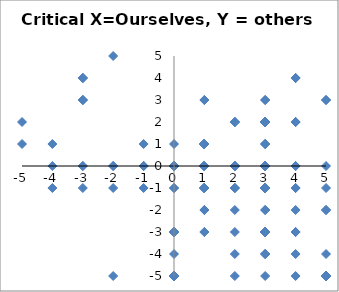
| Category | Critical_Others |
|---|---|
| -5.0 | 1 |
| -2.0 | 0 |
| -4.0 | -1 |
| 0.0 | 0 |
| 3.0 | -3 |
| 2.0 | 0 |
| 5.0 | -5 |
| 1.0 | 0 |
| 0.0 | 0 |
| -1.0 | 0 |
| 1.0 | -1 |
| 2.0 | -2 |
| 1.0 | 0 |
| -3.0 | 3 |
| -3.0 | 3 |
| 3.0 | 0 |
| 3.0 | 0 |
| 3.0 | -2 |
| -3.0 | 4 |
| -1.0 | 0 |
| 4.0 | -4 |
| -3.0 | 4 |
| 1.0 | 1 |
| 4.0 | -3 |
| 1.0 | 0 |
| 1.0 | -3 |
| 1.0 | 0 |
| 1.0 | 0 |
| 1.0 | 0 |
| 5.0 | -1 |
| 1.0 | 1 |
| 1.0 | 1 |
| 3.0 | -1 |
| 1.0 | 1 |
| 1.0 | 1 |
| 1.0 | 1 |
| 4.0 | -2 |
| 1.0 | 1 |
| -3.0 | 4 |
| 1.0 | 1 |
| 1.0 | 1 |
| 4.0 | -5 |
| 1.0 | 0 |
| 1.0 | 0 |
| 1.0 | 0 |
| 3.0 | -4 |
| 1.0 | 0 |
| 1.0 | 0 |
| 1.0 | 0 |
| 1.0 | 0 |
| -3.0 | 3 |
| 1.0 | 0 |
| 3.0 | 2 |
| 3.0 | 2 |
| 3.0 | 2 |
| 1.0 | 1 |
| -1.0 | -1 |
| 4.0 | 4 |
| 3.0 | -4 |
| 1.0 | 0 |
| 4.0 | 2 |
| 4.0 | 0 |
| 5.0 | 3 |
| 3.0 | 2 |
| 2.0 | 0 |
| 3.0 | -1 |
| 3.0 | 2 |
| 2.0 | 0 |
| 3.0 | -3 |
| 1.0 | 0 |
| 1.0 | 0 |
| 1.0 | 0 |
| 4.0 | 4 |
| 4.0 | 4 |
| 1.0 | 3 |
| 3.0 | -3 |
| 3.0 | 2 |
| 2.0 | -4 |
| 1.0 | 1 |
| 1.0 | 1 |
| 1.0 | 1 |
| -3.0 | 0 |
| 3.0 | 1 |
| 3.0 | 0 |
| 3.0 | -3 |
| 1.0 | 1 |
| 1.0 | 1 |
| 3.0 | 2 |
| 3.0 | 2 |
| 1.0 | 1 |
| 3.0 | 2 |
| 3.0 | 3 |
| 1.0 | 1 |
| 1.0 | 1 |
| -3.0 | -1 |
| 5.0 | 3 |
| 1.0 | 1 |
| 3.0 | 2 |
| 3.0 | 2 |
| 3.0 | -3 |
| 0.0 | 0 |
| 3.0 | 2 |
| 1.0 | 1 |
| 0.0 | 0 |
| 0.0 | 0 |
| 0.0 | 0 |
| 3.0 | 2 |
| 2.0 | 2 |
| 2.0 | 2 |
| 0.0 | 0 |
| 0.0 | 0 |
| 0.0 | 0 |
| 1.0 | 0 |
| 3.0 | -1 |
| 2.0 | -1 |
| 3.0 | -3 |
| 3.0 | -3 |
| 1.0 | 1 |
| 0.0 | 0 |
| 0.0 | 0 |
| 2.0 | 2 |
| 3.0 | -3 |
| 3.0 | 0 |
| 2.0 | 2 |
| 1.0 | 3 |
| 3.0 | 3 |
| 3.0 | 1 |
| 3.0 | -3 |
| 4.0 | 2 |
| 0.0 | 0 |
| 3.0 | 2 |
| 0.0 | 0 |
| 0.0 | 0 |
| -2.0 | -1 |
| 0.0 | 0 |
| 3.0 | 2 |
| 1.0 | 1 |
| 1.0 | 1 |
| 0.0 | 0 |
| 0.0 | 0 |
| 0.0 | 0 |
| 1.0 | 0 |
| 1.0 | 0 |
| 2.0 | 0 |
| 1.0 | 1 |
| 1.0 | -2 |
| 1.0 | -2 |
| 1.0 | 0 |
| 1.0 | 1 |
| 0.0 | 0 |
| 1.0 | -1 |
| 0.0 | 0 |
| 3.0 | 1 |
| 0.0 | 0 |
| 0.0 | 0 |
| 1.0 | 0 |
| 0.0 | 0 |
| 3.0 | 0 |
| 3.0 | -5 |
| 0.0 | 0 |
| 0.0 | 0 |
| -3.0 | 0 |
| 1.0 | -3 |
| 4.0 | 2 |
| 0.0 | 0 |
| 0.0 | 0 |
| 0.0 | 0 |
| 0.0 | 0 |
| 0.0 | -3 |
| 0.0 | -3 |
| 0.0 | 0 |
| 1.0 | 1 |
| 0.0 | 0 |
| 0.0 | 1 |
| 3.0 | 2 |
| 3.0 | 0 |
| 0.0 | 0 |
| 3.0 | 2 |
| 0.0 | 0 |
| 0.0 | 0 |
| 0.0 | 0 |
| 1.0 | 0 |
| 0.0 | 0 |
| 0.0 | 0 |
| 3.0 | -3 |
| 0.0 | 0 |
| 3.0 | -3 |
| 0.0 | 0 |
| 0.0 | 0 |
| 0.0 | 0 |
| 0.0 | 0 |
| 0.0 | 0 |
| 0.0 | 0 |
| -1.0 | 0 |
| 0.0 | 0 |
| 0.0 | 0 |
| 0.0 | 0 |
| 0.0 | 0 |
| 0.0 | 0 |
| 0.0 | 0 |
| 0.0 | 0 |
| 0.0 | 0 |
| 0.0 | 0 |
| 0.0 | 0 |
| 0.0 | 0 |
| 0.0 | 0 |
| 0.0 | 0 |
| 0.0 | 0 |
| 0.0 | 0 |
| 0.0 | 0 |
| 0.0 | 0 |
| 0.0 | 0 |
| 0.0 | 0 |
| 1.0 | -1 |
| 1.0 | -1 |
| 0.0 | 0 |
| 0.0 | 0 |
| 0.0 | 0 |
| 0.0 | 0 |
| 0.0 | 0 |
| 0.0 | 0 |
| 0.0 | 0 |
| 0.0 | 0 |
| 0.0 | 0 |
| 3.0 | -3 |
| 3.0 | -3 |
| 3.0 | -3 |
| 3.0 | -3 |
| 0.0 | 0 |
| 0.0 | 0 |
| 3.0 | -3 |
| -2.0 | 0 |
| 1.0 | -1 |
| 1.0 | -1 |
| 0.0 | 0 |
| 1.0 | -1 |
| 0.0 | 0 |
| 0.0 | 0 |
| 0.0 | 0 |
| 3.0 | -1 |
| 1.0 | -1 |
| 0.0 | 0 |
| 0.0 | 0 |
| 1.0 | -1 |
| 0.0 | 0 |
| 1.0 | -1 |
| 0.0 | 0 |
| 0.0 | 0 |
| 0.0 | 0 |
| 0.0 | 0 |
| 3.0 | -1 |
| 3.0 | -1 |
| 3.0 | -1 |
| 3.0 | -1 |
| 1.0 | -1 |
| 3.0 | 0 |
| 3.0 | -1 |
| 1.0 | 0 |
| 0.0 | 0 |
| 0.0 | 0 |
| 0.0 | 0 |
| 0.0 | 0 |
| 2.0 | -1 |
| 0.0 | 0 |
| 0.0 | 0 |
| 0.0 | 0 |
| 0.0 | -3 |
| 0.0 | 0 |
| 0.0 | 0 |
| 0.0 | 0 |
| 0.0 | 0 |
| 0.0 | 0 |
| 0.0 | 0 |
| 0.0 | 0 |
| 0.0 | 0 |
| 3.0 | 0 |
| 0.0 | -5 |
| 0.0 | -5 |
| 0.0 | -4 |
| 0.0 | -5 |
| 0.0 | -5 |
| 5.0 | 0 |
| 0.0 | -5 |
| 3.0 | 0 |
| 3.0 | 0 |
| 0.0 | 0 |
| 0.0 | 0 |
| 0.0 | 0 |
| 0.0 | 0 |
| 0.0 | -5 |
| 0.0 | -5 |
| 4.0 | 0 |
| 0.0 | -5 |
| -2.0 | 5 |
| 0.0 | 0 |
| 0.0 | 0 |
| 0.0 | 0 |
| 0.0 | 0 |
| 0.0 | 0 |
| 0.0 | 0 |
| 0.0 | 0 |
| 0.0 | 0 |
| 0.0 | 0 |
| 0.0 | 0 |
| 0.0 | 0 |
| 0.0 | 0 |
| 0.0 | 0 |
| 0.0 | 0 |
| 0.0 | 0 |
| 0.0 | 0 |
| 0.0 | 0 |
| 0.0 | 0 |
| 0.0 | 0 |
| 0.0 | 0 |
| 0.0 | 0 |
| 0.0 | 0 |
| 0.0 | 0 |
| 0.0 | 0 |
| 0.0 | 0 |
| 0.0 | 0 |
| 0.0 | 0 |
| 0.0 | 0 |
| 0.0 | 0 |
| 0.0 | 0 |
| 0.0 | 0 |
| 0.0 | 0 |
| 0.0 | 0 |
| 0.0 | 0 |
| 0.0 | 0 |
| 0.0 | 0 |
| 0.0 | 0 |
| 0.0 | 0 |
| 0.0 | 0 |
| 0.0 | 0 |
| 0.0 | 0 |
| 0.0 | 0 |
| 0.0 | 0 |
| 0.0 | 0 |
| 0.0 | 0 |
| 0.0 | 0 |
| 0.0 | 0 |
| 0.0 | 0 |
| 0.0 | 0 |
| 0.0 | 0 |
| 0.0 | 0 |
| 0.0 | 0 |
| 0.0 | 0 |
| 0.0 | 0 |
| 1.0 | 0 |
| 1.0 | 0 |
| 0.0 | 0 |
| 0.0 | 0 |
| 0.0 | 0 |
| 0.0 | 0 |
| 3.0 | -1 |
| 0.0 | -1 |
| 0.0 | 0 |
| 0.0 | 0 |
| 0.0 | 0 |
| 0.0 | 0 |
| 0.0 | 0 |
| 0.0 | 0 |
| 0.0 | 0 |
| 0.0 | 0 |
| 0.0 | 0 |
| 0.0 | 0 |
| 1.0 | -1 |
| 0.0 | 0 |
| 0.0 | 0 |
| 0.0 | 0 |
| 0.0 | 0 |
| 0.0 | 0 |
| 0.0 | 0 |
| 0.0 | 0 |
| 0.0 | 0 |
| 0.0 | 0 |
| 0.0 | 0 |
| 0.0 | 0 |
| 0.0 | 0 |
| 0.0 | 0 |
| 0.0 | 0 |
| 0.0 | 0 |
| 0.0 | 0 |
| 0.0 | 0 |
| 0.0 | 0 |
| 0.0 | 0 |
| 0.0 | 0 |
| 0.0 | 0 |
| 0.0 | 0 |
| 0.0 | 0 |
| 0.0 | 0 |
| 0.0 | 0 |
| 0.0 | 0 |
| 0.0 | 0 |
| 0.0 | 0 |
| 0.0 | 0 |
| 0.0 | 0 |
| 0.0 | 0 |
| 0.0 | 0 |
| 0.0 | 0 |
| 0.0 | 0 |
| 0.0 | 0 |
| 1.0 | -1 |
| 0.0 | 0 |
| 0.0 | 0 |
| 0.0 | 0 |
| 0.0 | 0 |
| 0.0 | 0 |
| 0.0 | 0 |
| 0.0 | 0 |
| 0.0 | 0 |
| 0.0 | 0 |
| 0.0 | 0 |
| 0.0 | 0 |
| 0.0 | 0 |
| 0.0 | 0 |
| 0.0 | 0 |
| 0.0 | 0 |
| 0.0 | 0 |
| 0.0 | 0 |
| 0.0 | 0 |
| 0.0 | 0 |
| 0.0 | 0 |
| 0.0 | 0 |
| 0.0 | 0 |
| 0.0 | 0 |
| 0.0 | 0 |
| 0.0 | 0 |
| 0.0 | 0 |
| 0.0 | 0 |
| 0.0 | 0 |
| 0.0 | 0 |
| 0.0 | 0 |
| 1.0 | -1 |
| 0.0 | 0 |
| 0.0 | 0 |
| 0.0 | 0 |
| 1.0 | -1 |
| 0.0 | 0 |
| 1.0 | 0 |
| 1.0 | 0 |
| 2.0 | 0 |
| 3.0 | 0 |
| 3.0 | -2 |
| 4.0 | -3 |
| 5.0 | -4 |
| 5.0 | -5 |
| 0.0 | 0 |
| 1.0 | -1 |
| -1.0 | 1 |
| 0.0 | 0 |
| 0.0 | 0 |
| 0.0 | 0 |
| 0.0 | 0 |
| 5.0 | -2 |
| -4.0 | 1 |
| 0.0 | 0 |
| 0.0 | 0 |
| 0.0 | 0 |
| 0.0 | 0 |
| 0.0 | -1 |
| 0.0 | 0 |
| 0.0 | 0 |
| 0.0 | 0 |
| 0.0 | 0 |
| 0.0 | 0 |
| 0.0 | 0 |
| 0.0 | 0 |
| 0.0 | 0 |
| 0.0 | -3 |
| 0.0 | 0 |
| 0.0 | 0 |
| 0.0 | 0 |
| 0.0 | 0 |
| 0.0 | 0 |
| 3.0 | 0 |
| 3.0 | 0 |
| 3.0 | 0 |
| 3.0 | 0 |
| 4.0 | -1 |
| 4.0 | -1 |
| 3.0 | -3 |
| 3.0 | -4 |
| 2.0 | -5 |
| 2.0 | -1 |
| 1.0 | -1 |
| 3.0 | -1 |
| 0.0 | 0 |
| 0.0 | 0 |
| 0.0 | 0 |
| 0.0 | 0 |
| 0.0 | 0 |
| 0.0 | 0 |
| 0.0 | 0 |
| 0.0 | 0 |
| 0.0 | 0 |
| 0.0 | 0 |
| -1.0 | 0 |
| 1.0 | -1 |
| 2.0 | -3 |
| 0.0 | 0 |
| 0.0 | 0 |
| 0.0 | 0 |
| 5.0 | -5 |
| 5.0 | -5 |
| 5.0 | -5 |
| 5.0 | -5 |
| 5.0 | -5 |
| 5.0 | -5 |
| 5.0 | -5 |
| 5.0 | -5 |
| 5.0 | -5 |
| 5.0 | -5 |
| 5.0 | -5 |
| 5.0 | -5 |
| 5.0 | -5 |
| 5.0 | -5 |
| 5.0 | -5 |
| -4.0 | 0 |
| -2.0 | -5 |
| 5.0 | -2 |
| -5.0 | 2 |
| 0.0 | 0 |
| 0.0 | 0 |
| 0.0 | 0 |
| 0.0 | 0 |
| 1.0 | 0 |
| 1.0 | 0 |
| 0.0 | 0 |
| 0.0 | 0 |
| 0.0 | 0 |
| 0.0 | 0 |
| 0.0 | 0 |
| 0.0 | 0 |
| 0.0 | 0 |
| 0.0 | 0 |
| 0.0 | 0 |
| 0.0 | 0 |
| 0.0 | 0 |
| 0.0 | 0 |
| 1.0 | 0 |
| 1.0 | 0 |
| 0.0 | 0 |
| 0.0 | 0 |
| 0.0 | 0 |
| 0.0 | 0 |
| 0.0 | 0 |
| 0.0 | 0 |
| 0.0 | 0 |
| 0.0 | 0 |
| 0.0 | 0 |
| 0.0 | 0 |
| 0.0 | 0 |
| 0.0 | 0 |
| 0.0 | 0 |
| 0.0 | 0 |
| 0.0 | 0 |
| 0.0 | 0 |
| 2.0 | 0 |